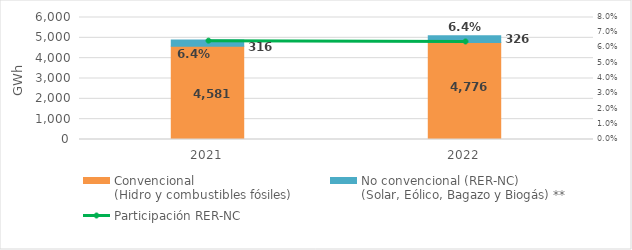
| Category | Convencional
(Hidro y combustibles fósiles) | No convencional (RER-NC)
(Solar, Eólico, Bagazo y Biogás) ** |
|---|---|---|
| 2021.0 | 4580.584 | 315.777 |
| 2022.0 | 4775.589 | 326.281 |